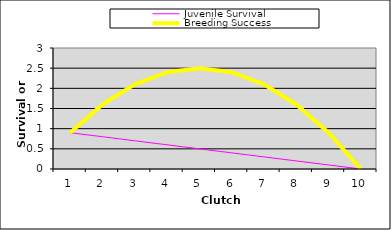
| Category | Juvenile Survival | Breeding Success |
|---|---|---|
| 1.0 | 0.9 | 0.9 |
| 2.0 | 0.8 | 1.6 |
| 3.0 | 0.7 | 2.1 |
| 4.0 | 0.6 | 2.4 |
| 5.0 | 0.5 | 2.5 |
| 6.0 | 0.4 | 2.4 |
| 7.0 | 0.3 | 2.1 |
| 8.0 | 0.2 | 1.6 |
| 9.0 | 0.1 | 0.9 |
| 10.0 | 0 | 0 |